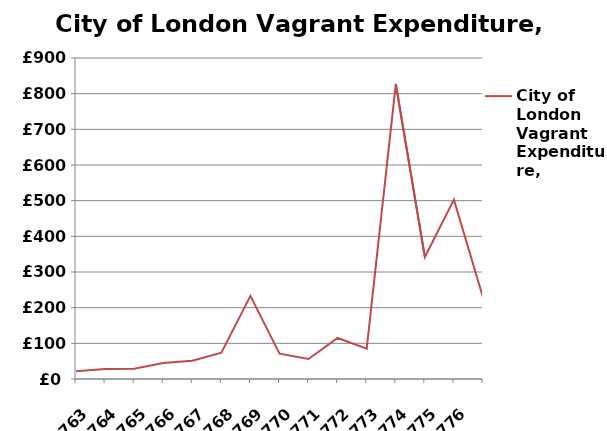
| Category | City of London Vagrant Expenditure, 1739-1792 |
|---|---|
| 1763 | 22 |
| 1764 | 28 |
| 1765 | 29 |
| 1766 | 45 |
| 1767 | 51 |
| 1768 | 74 |
| 1769 | 233 |
| 1770 | 71 |
| 1771 | 56 |
| 1772 | 115 |
| 1773 | 85 |
| 1774 | 827 |
| 1775 | 342 |
| 1776 | 503 |